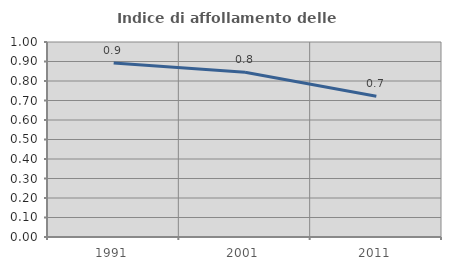
| Category | Indice di affollamento delle abitazioni  |
|---|---|
| 1991.0 | 0.893 |
| 2001.0 | 0.845 |
| 2011.0 | 0.722 |